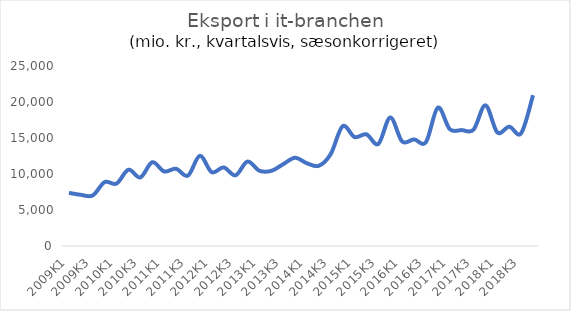
| Category | It-branchen i alt |
|---|---|
| 2009K1 | 7380 |
| 2009K2 | 7108 |
| 2009K3 | 7025 |
| 2009K4 | 8876 |
| 2010K1 | 8673 |
| 2010K2 | 10597 |
| 2010K3 | 9522 |
| 2010K4 | 11636 |
| 2011K1 | 10355 |
| 2011K2 | 10726 |
| 2011K3 | 9775 |
| 2011K4 | 12523 |
| 2012K1 | 10250 |
| 2012K2 | 10916 |
| 2012K3 | 9816 |
| 2012K4 | 11730 |
| 2013K1 | 10463 |
| 2013K2 | 10434 |
| 2013K3 | 11356 |
| 2013K4 | 12255 |
| 2014K1 | 11492 |
| 2014K2 | 11141 |
| 2014K3 | 12778 |
| 2014K4 | 16640 |
| 2015K1 | 15136 |
| 2015K2 | 15505 |
| 2015K3 | 14175 |
| 2015K4 | 17844 |
| 2016K1 | 14519 |
| 2016K2 | 14809 |
| 2016K3 | 14429 |
| 2016K4 | 19212 |
| 2017K1 | 16229 |
| 2017K2 | 16099 |
| 2017K3 | 16160 |
| 2017K4 | 19536 |
| 2018K1 | 15771 |
| 2018K2 | 16571 |
| 2018K3 | 15660 |
| 2018K4 | 20943 |